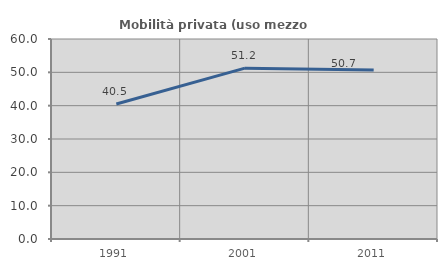
| Category | Mobilità privata (uso mezzo privato) |
|---|---|
| 1991.0 | 40.512 |
| 2001.0 | 51.246 |
| 2011.0 | 50.693 |